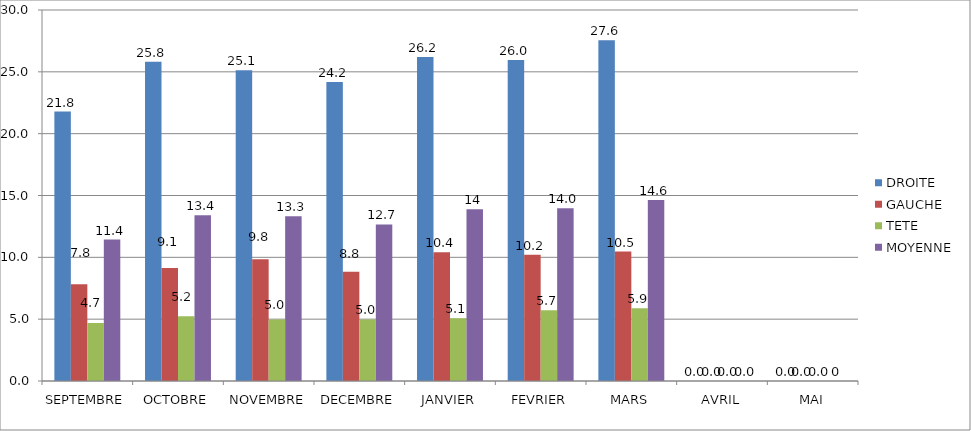
| Category | DROITE | GAUCHE | TETE | MOYENNE |
|---|---|---|---|---|
| SEPTEMBRE | 21.787 | 7.833 | 4.7 | 11.44 |
| OCTOBRE | 25.818 | 9.136 | 5.236 | 13.397 |
| NOVEMBRE | 25.126 | 9.844 | 4.97 | 13.314 |
| DECEMBRE | 24.174 | 8.826 | 4.978 | 12.659 |
| JANVIER | 26.192 | 10.413 | 5.077 | 13.894 |
| FEVRIER | 25.951 | 10.213 | 5.721 | 13.962 |
| MARS | 27.561 | 10.464 | 5.877 | 14.634 |
| AVRIL | 0 | 0 | 0 | 0 |
| MAI | 0 | 0 | 0 | 0 |